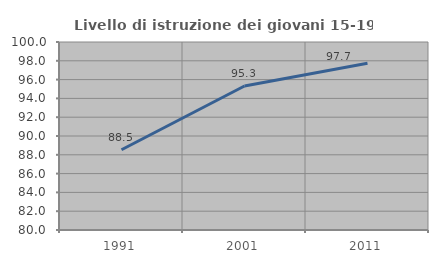
| Category | Livello di istruzione dei giovani 15-19 anni |
|---|---|
| 1991.0 | 88.536 |
| 2001.0 | 95.32 |
| 2011.0 | 97.748 |